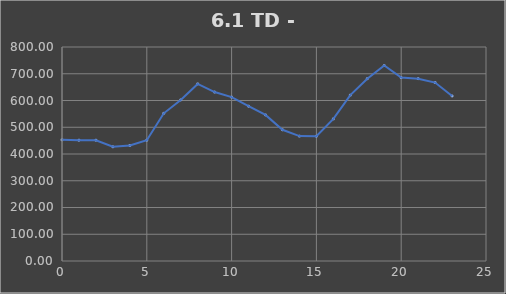
| Category | TOTAL |
|---|---|
| 0.0 | 453.035 |
| 1.0 | 451.585 |
| 2.0 | 451.585 |
| 3.0 | 426.965 |
| 4.0 | 431.975 |
| 5.0 | 451.685 |
| 6.0 | 552.085 |
| 7.0 | 602.085 |
| 8.0 | 661.972 |
| 9.0 | 631.631 |
| 10.0 | 612.631 |
| 11.0 | 578.721 |
| 12.0 | 546.031 |
| 13.0 | 490.631 |
| 14.0 | 466.872 |
| 15.0 | 466.572 |
| 16.0 | 531.282 |
| 17.0 | 620.052 |
| 18.0 | 681.631 |
| 19.0 | 730.631 |
| 20.0 | 685.541 |
| 21.0 | 681.631 |
| 22.0 | 666.972 |
| 23.0 | 616.972 |